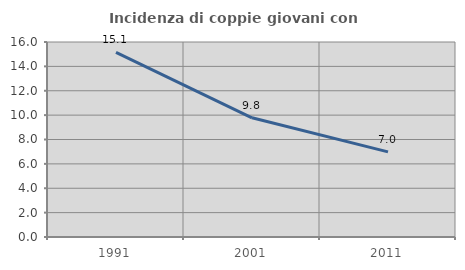
| Category | Incidenza di coppie giovani con figli |
|---|---|
| 1991.0 | 15.142 |
| 2001.0 | 9.783 |
| 2011.0 | 6.985 |